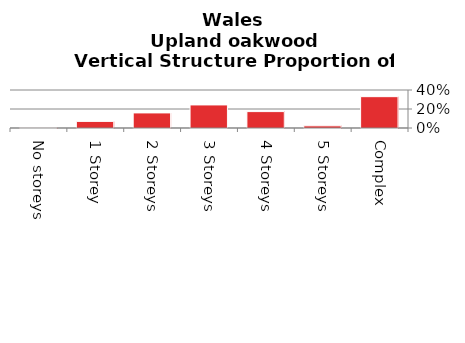
| Category | Upland oakwood |
|---|---|
| No storeys | 0.003 |
| 1 Storey | 0.07 |
| 2 Storeys | 0.159 |
| 3 Storeys | 0.243 |
| 4 Storeys | 0.173 |
| 5 Storeys | 0.023 |
| Complex | 0.33 |